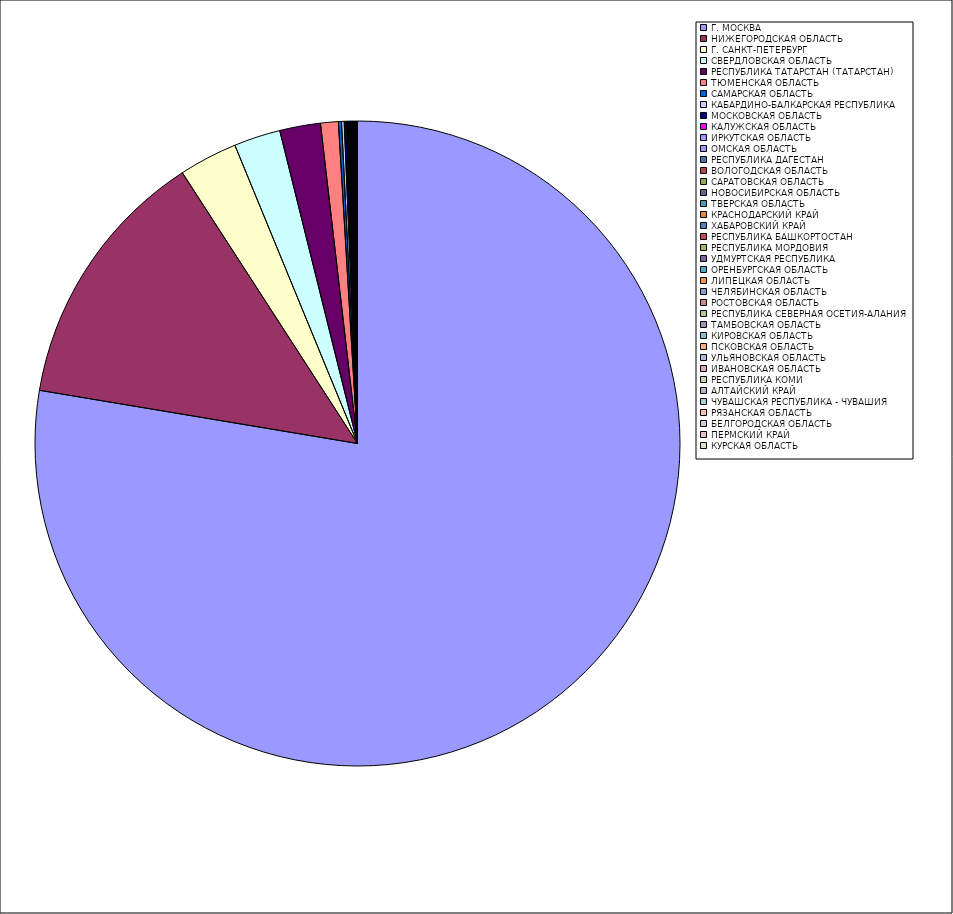
| Category | Оборот |
|---|---|
| Г. МОСКВА | 77.606 |
| НИЖЕГОРОДСКАЯ ОБЛАСТЬ | 13.217 |
| Г. САНКТ-ПЕТЕРБУРГ | 2.93 |
| СВЕРДЛОВСКАЯ ОБЛАСТЬ | 2.33 |
| РЕСПУБЛИКА ТАТАРСТАН (ТАТАРСТАН) | 2.042 |
| ТЮМЕНСКАЯ ОБЛАСТЬ | 0.889 |
| САМАРСКАЯ ОБЛАСТЬ | 0.154 |
| КАБАРДИНО-БАЛКАРСКАЯ РЕСПУБЛИКА | 0.133 |
| МОСКОВСКАЯ ОБЛАСТЬ | 0.105 |
| КАЛУЖСКАЯ ОБЛАСТЬ | 0.049 |
| ИРКУТСКАЯ ОБЛАСТЬ | 0.042 |
| ОМСКАЯ ОБЛАСТЬ | 0.041 |
| РЕСПУБЛИКА ДАГЕСТАН | 0.034 |
| ВОЛОГОДСКАЯ ОБЛАСТЬ | 0.031 |
| САРАТОВСКАЯ ОБЛАСТЬ | 0.027 |
| НОВОСИБИРСКАЯ ОБЛАСТЬ | 0.024 |
| ТВЕРСКАЯ ОБЛАСТЬ | 0.023 |
| КРАСНОДАРСКИЙ КРАЙ | 0.019 |
| ХАБАРОВСКИЙ КРАЙ | 0.019 |
| РЕСПУБЛИКА БАШКОРТОСТАН | 0.019 |
| РЕСПУБЛИКА МОРДОВИЯ | 0.018 |
| УДМУРТСКАЯ РЕСПУБЛИКА | 0.016 |
| ОРЕНБУРГСКАЯ ОБЛАСТЬ | 0.016 |
| ЛИПЕЦКАЯ ОБЛАСТЬ | 0.016 |
| ЧЕЛЯБИНСКАЯ ОБЛАСТЬ | 0.015 |
| РОСТОВСКАЯ ОБЛАСТЬ | 0.014 |
| РЕСПУБЛИКА СЕВЕРНАЯ ОСЕТИЯ-АЛАНИЯ | 0.013 |
| ТАМБОВСКАЯ ОБЛАСТЬ | 0.013 |
| КИРОВСКАЯ ОБЛАСТЬ | 0.012 |
| ПСКОВСКАЯ ОБЛАСТЬ | 0.012 |
| УЛЬЯНОВСКАЯ ОБЛАСТЬ | 0.012 |
| ИВАНОВСКАЯ ОБЛАСТЬ | 0.011 |
| РЕСПУБЛИКА КОМИ | 0.011 |
| АЛТАЙСКИЙ КРАЙ | 0.01 |
| ЧУВАШСКАЯ РЕСПУБЛИКА - ЧУВАШИЯ | 0.01 |
| РЯЗАНСКАЯ ОБЛАСТЬ | 0.008 |
| БЕЛГОРОДСКАЯ ОБЛАСТЬ | 0.007 |
| ПЕРМСКИЙ КРАЙ | 0.006 |
| КУРСКАЯ ОБЛАСТЬ | 0.006 |